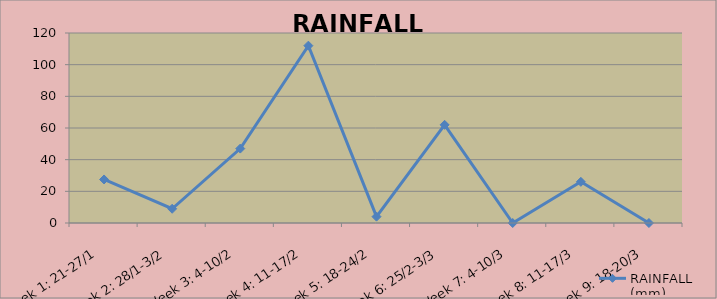
| Category | RAINFALL (mm) |
|---|---|
| Week 1: 21-27/1 | 27.5 |
| Week 2: 28/1-3/2 | 9 |
| Week 3: 4-10/2 | 47 |
| Week 4: 11-17/2 | 112 |
| Week 5: 18-24/2 | 4 |
| Week 6: 25/2-3/3 | 62 |
| Week 7: 4-10/3 | 0 |
| Week 8: 11-17/3 | 26 |
| Week 9: 18-20/3 | 0 |